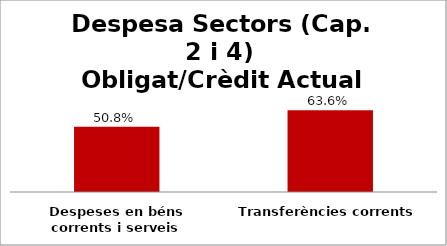
| Category | Series 0 |
|---|---|
| Despeses en béns corrents i serveis | 0.508 |
| Transferències corrents | 0.636 |